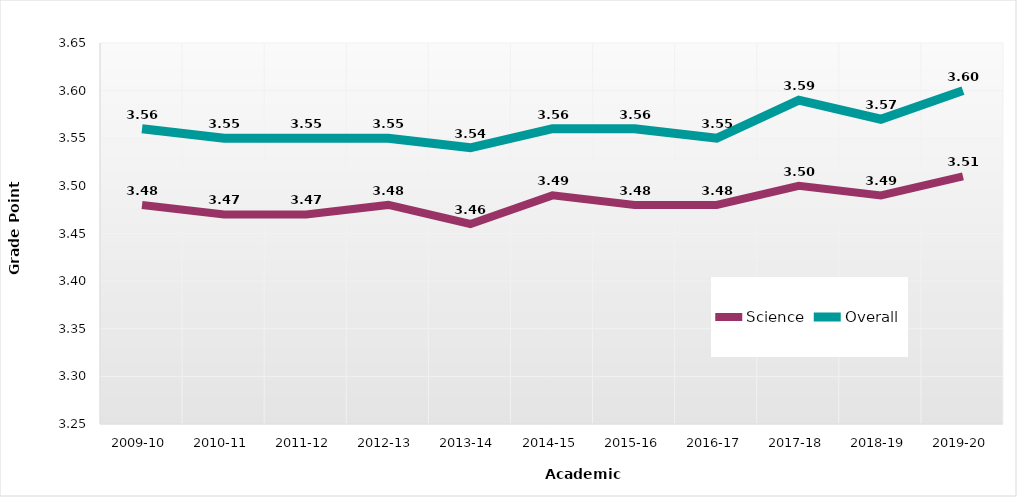
| Category | Science | Overall |
|---|---|---|
| 2009-10 | 3.48 | 3.56 |
| 2010-11 | 3.47 | 3.55 |
| 2011-12 | 3.47 | 3.55 |
| 2012-13 | 3.48 | 3.55 |
| 2013-14 | 3.46 | 3.54 |
| 2014-15 | 3.49 | 3.56 |
| 2015-16 | 3.48 | 3.56 |
| 2016-17 | 3.48 | 3.55 |
| 2017-18 | 3.5 | 3.59 |
| 2018-19 | 3.49 | 3.57 |
| 2019-20 | 3.51 | 3.6 |